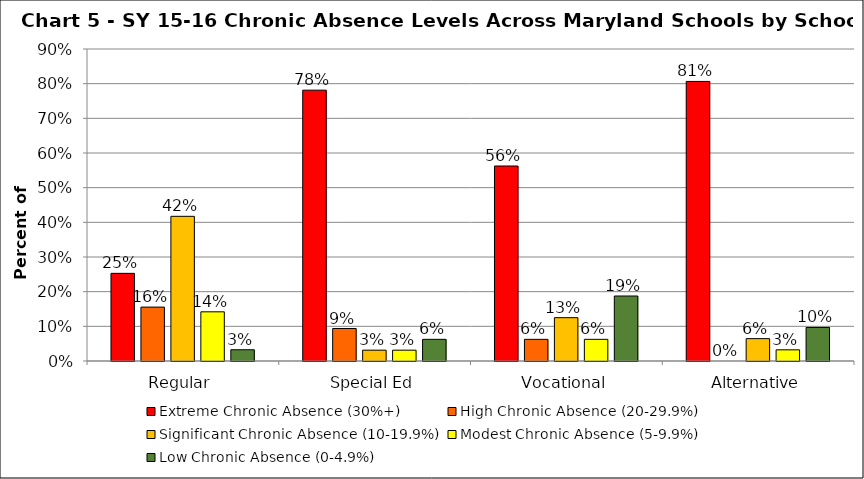
| Category | Extreme Chronic Absence (30%+) | High Chronic Absence (20-29.9%) | Significant Chronic Absence (10-19.9%) | Modest Chronic Absence (5-9.9%) | Low Chronic Absence (0-4.9%) |
|---|---|---|---|---|---|
| 0 | 0.253 | 0.155 | 0.417 | 0.142 | 0.032 |
| 1 | 0.781 | 0.094 | 0.031 | 0.031 | 0.062 |
| 2 | 0.562 | 0.062 | 0.125 | 0.062 | 0.188 |
| 3 | 0.806 | 0 | 0.065 | 0.032 | 0.097 |